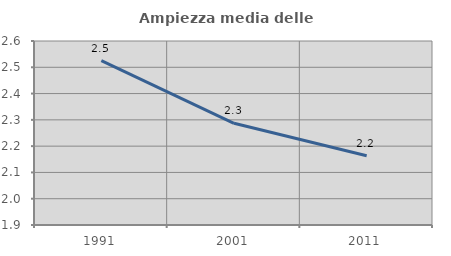
| Category | Ampiezza media delle famiglie |
|---|---|
| 1991.0 | 2.525 |
| 2001.0 | 2.287 |
| 2011.0 | 2.164 |